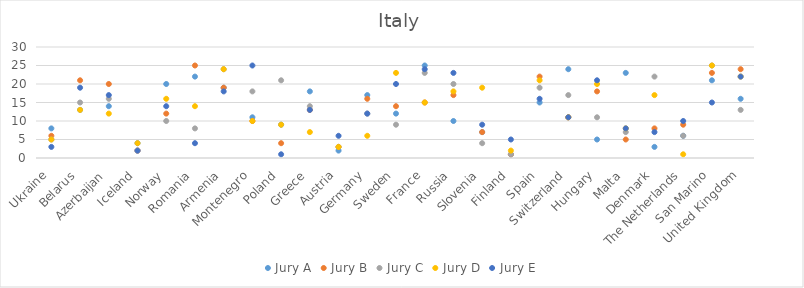
| Category | Jury A | Jury B | Jury C | Jury D | Jury E |
|---|---|---|---|---|---|
| Ukraine | 8 | 6 | 5 | 5 | 3 |
| Belarus | 13 | 21 | 15 | 13 | 19 |
| Azerbaijan | 14 | 20 | 16 | 12 | 17 |
| Iceland | 4 | 2 | 2 | 4 | 2 |
| Norway | 20 | 12 | 10 | 16 | 14 |
| Romania | 22 | 25 | 8 | 14 | 4 |
| Armenia | 19 | 19 | 24 | 24 | 18 |
| Montenegro | 11 | 10 | 18 | 10 | 25 |
| Poland | 9 | 4 | 21 | 9 | 1 |
| Greece | 18 | 13 | 14 | 7 | 13 |
| Austria | 2 | 3 | 3 | 3 | 6 |
| Germany | 17 | 16 | 12 | 6 | 12 |
| Sweden | 12 | 14 | 9 | 23 | 20 |
| France | 25 | 15 | 23 | 15 | 24 |
| Russia | 10 | 17 | 20 | 18 | 23 |
| Slovenia | 7 | 7 | 4 | 19 | 9 |
| Finland | 1 | 1 | 1 | 2 | 5 |
| Spain | 15 | 22 | 19 | 21 | 16 |
| Switzerland | 24 | 11 | 17 | 11 | 11 |
| Hungary | 5 | 18 | 11 | 20 | 21 |
| Malta | 23 | 5 | 7 | 8 | 8 |
| Denmark | 3 | 8 | 22 | 17 | 7 |
| The Netherlands | 6 | 9 | 6 | 1 | 10 |
| San Marino | 21 | 23 | 25 | 25 | 15 |
| United Kingdom | 16 | 24 | 13 | 22 | 22 |